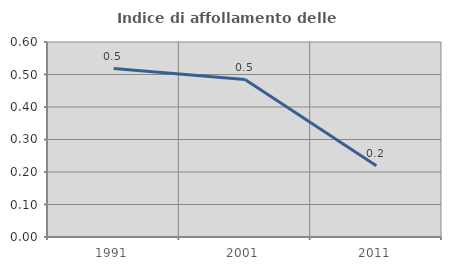
| Category | Indice di affollamento delle abitazioni  |
|---|---|
| 1991.0 | 0.518 |
| 2001.0 | 0.484 |
| 2011.0 | 0.219 |